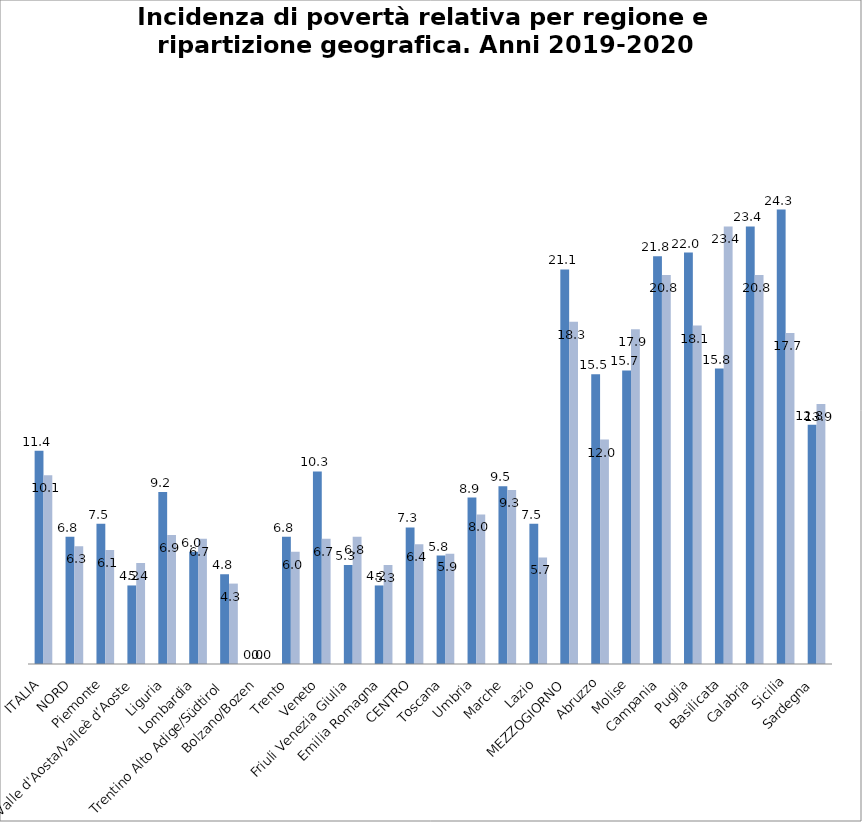
| Category | 2017 | 2018 |
|---|---|---|
| ITALIA | 11.4 | 10.1 |
| NORD | 6.8 | 6.3 |
| Piemonte | 7.5 | 6.1 |
| Valle d'Aosta/Valleè d’Aoste | 4.2 | 5.4 |
| Liguria | 9.2 | 6.9 |
| Lombardia | 6 | 6.7 |
| Trentino Alto Adige/Südtirol | 4.8 | 4.3 |
| Bolzano/Bozen | 0 | 0 |
| Trento | 6.8 | 6 |
| Veneto | 10.3 | 6.7 |
| Friuli Venezia Giulia | 5.3 | 6.8 |
| Emilia Romagna | 4.2 | 5.3 |
| CENTRO | 7.3 | 6.4 |
| Toscana | 5.8 | 5.9 |
| Umbria | 8.9 | 8 |
| Marche | 9.5 | 9.3 |
| Lazio | 7.5 | 5.7 |
| MEZZOGIORNO | 21.1 | 18.3 |
| Abruzzo | 15.5 | 12 |
| Molise | 15.7 | 17.9 |
| Campania | 21.8 | 20.8 |
| Puglia | 22 | 18.1 |
| Basilicata | 15.8 | 23.4 |
| Calabria | 23.4 | 20.8 |
| Sicilia | 24.3 | 17.7 |
| Sardegna | 12.8 | 13.9 |